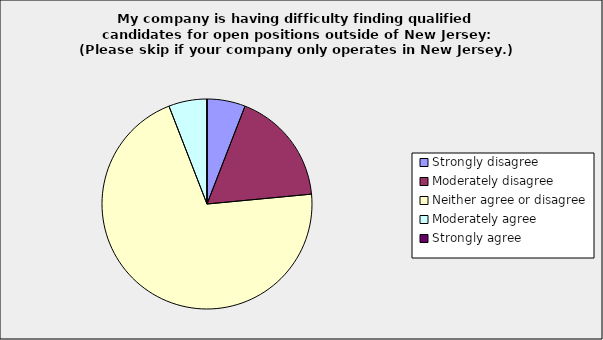
| Category | Series 0 |
|---|---|
| Strongly disagree | 0.059 |
| Moderately disagree | 0.176 |
| Neither agree or disagree | 0.706 |
| Moderately agree | 0.059 |
| Strongly agree | 0 |